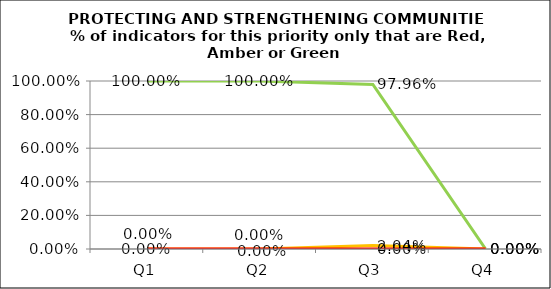
| Category | Green | Amber | Red |
|---|---|---|---|
| Q1 | 1 | 0 | 0 |
| Q2 | 1 | 0 | 0 |
| Q3 | 0.98 | 0.02 | 0 |
| Q4 | 0 | 0 | 0 |